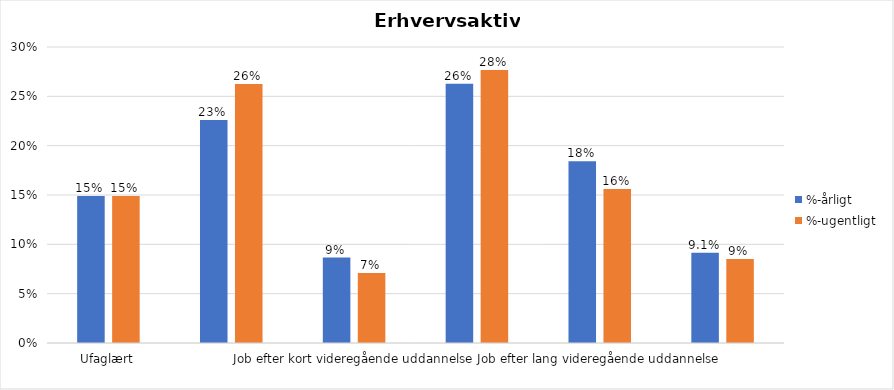
| Category | %-årligt | %-ugentligt |
|---|---|---|
| Ufaglært | 0.149 | 0.149 |
| Erhvervsfagligt job | 0.226 | 0.262 |
| Job efter kort videregående uddannelse | 0.087 | 0.071 |
| Job efter mellemlang videregående uddannelse | 0.263 | 0.277 |
| Job efter lang videregående uddannelse | 0.184 | 0.156 |
| Selvstændig | 0.091 | 0.085 |